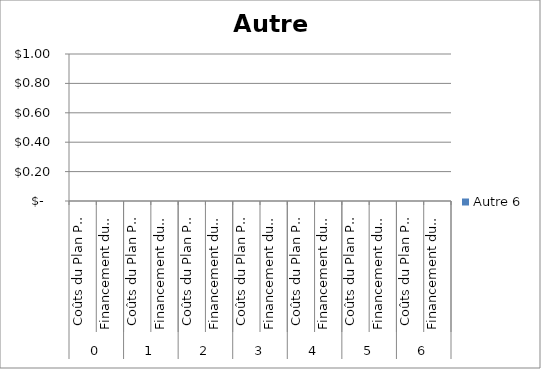
| Category | Autre 6 |
|---|---|
| 0 | 0 |
| 1 | 0 |
| 2 | 0 |
| 3 | 0 |
| 4 | 0 |
| 5 | 0 |
| 6 | 0 |
| 7 | 0 |
| 8 | 0 |
| 9 | 0 |
| 10 | 0 |
| 11 | 0 |
| 12 | 0 |
| 13 | 0 |